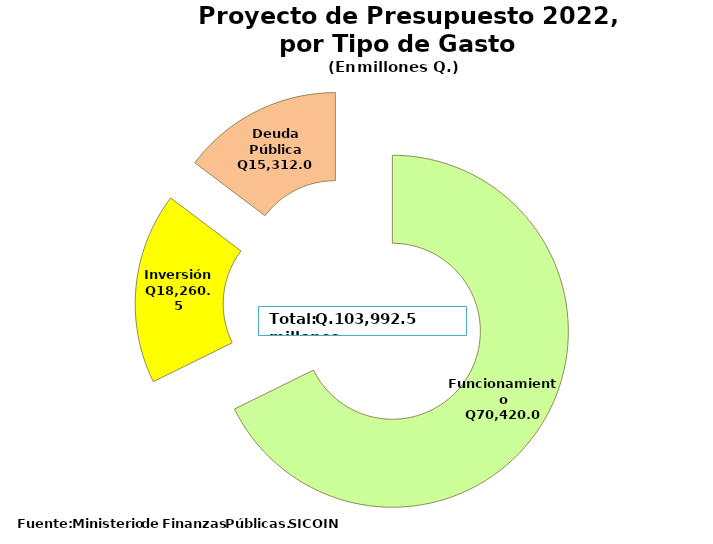
| Category | Recomendado 2022 |
|---|---|
| Funcionamiento | 70420 |
| Inversión | 18260.5 |
| Deuda Pública | 15312 |